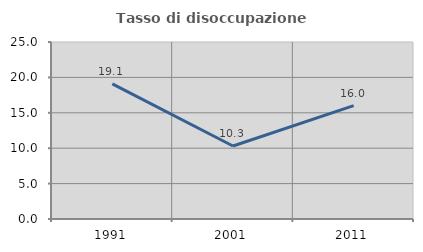
| Category | Tasso di disoccupazione giovanile  |
|---|---|
| 1991.0 | 19.079 |
| 2001.0 | 10.315 |
| 2011.0 | 16.014 |